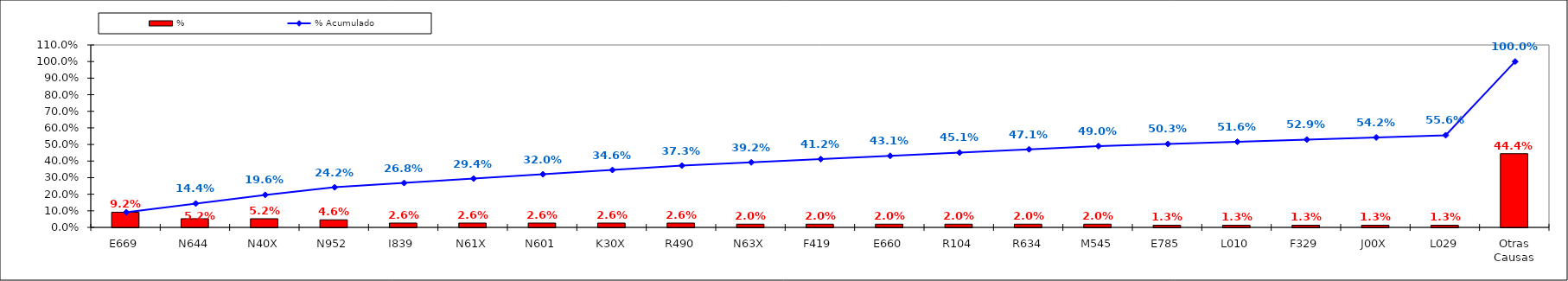
| Category | % |
|---|---|
| E669 | 0.092 |
| N644 | 0.052 |
| N40X | 0.052 |
| N952 | 0.046 |
| I839 | 0.026 |
| N61X | 0.026 |
| N601 | 0.026 |
| K30X | 0.026 |
| R490 | 0.026 |
| N63X | 0.02 |
| F419 | 0.02 |
| E660 | 0.02 |
| R104 | 0.02 |
| R634 | 0.02 |
| M545 | 0.02 |
| E785 | 0.013 |
| L010 | 0.013 |
| F329 | 0.013 |
| J00X | 0.013 |
| L029 | 0.013 |
| Otras Causas | 0.444 |